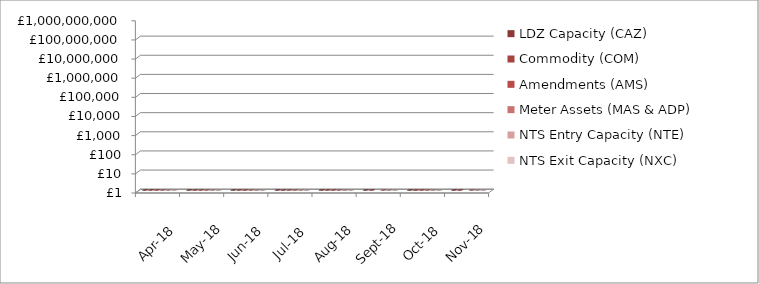
| Category | LDZ Capacity (CAZ) | Commodity (COM) | Amendments (AMS) | Meter Assets (MAS & ADP) | NTS Entry Capacity (NTE) | NTS Exit Capacity (NXC) |
|---|---|---|---|---|---|---|
| 2018-04-01 | 302200317.27 | 29034584.31 | 1543453.44 | 194233.3 | 1577511.57 | 18111359.22 |
| 2018-05-01 | 312174512.16 | 19449237 | 2024085.07 | 200707.08 | 1599795.55 | 18702620.75 |
| 2018-06-01 | 302299412.99 | 14591606.04 | 2213969.29 | 194233.54 | 1621553.61 | 18117525.2 |
| 2018-07-01 | 312562745.62 | 14290600.7 | 1483244.96 | 200707.69 | 1735803.71 | 18720256.49 |
| 2018-08-01 | 312780813.69 | 15048321.28 | 830443.17 | 200263.88 | 1735803.71 | 18720256.49 |
| 2018-09-01 | 302866760.19 | 17528307.3 | -385853.99 | 189788.22 | 1760935.51 | 18113875.74 |
| 2018-10-01 | 313359948.83 | 29476349.27 | 58182.64 | 196114.17 | 8332609.71 | 13807265.85 |
| 2018-11-01 | 303715362.33 | 37862420.69 | -765656.96 | 189786.88 | 8064487.69 | 13789980.96 |